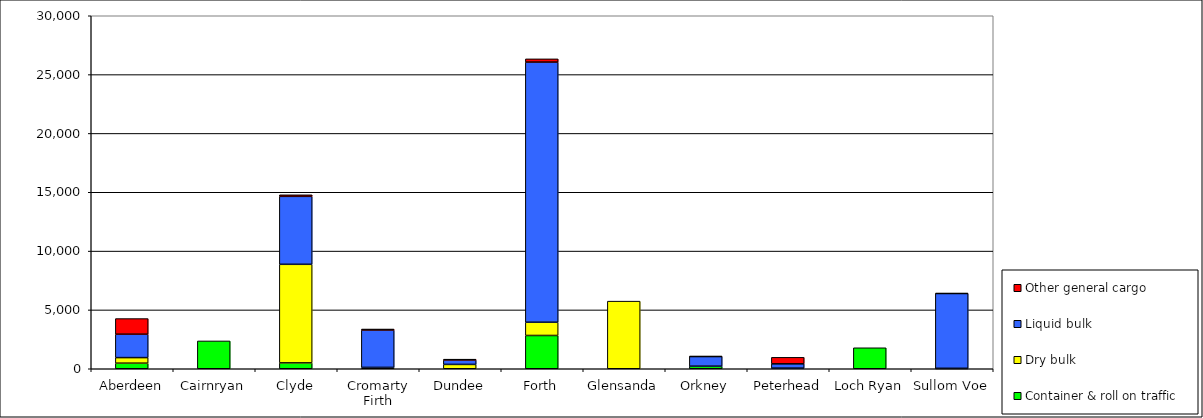
| Category | Container & roll on traffic | Dry bulk | Liquid bulk | Other general cargo |
|---|---|---|---|---|
| Aberdeen | 474 | 474 | 1987 | 1329 |
| Cairnryan | 2364 | 0 | 0 | 0 |
| Clyde | 499 | 8377 | 5777 | 130 |
| Cromarty Firth | 0 | 115 | 3178 | 85 |
| Dundee | 0 | 369 | 379 | 67 |
| Forth | 2828 | 1125 | 22109 | 273 |
| Glensanda | 0 | 5746 | 0 | 0 |
| Orkney | 208 | 11 | 824 | 11 |
| Peterhead | 0 | 53 | 364 | 554 |
| Loch Ryan | 1783 | 0 | 0 | 0 |
| Sullom Voe | 24 | 13 | 6357 | 24 |